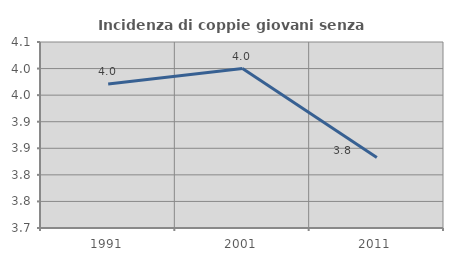
| Category | Incidenza di coppie giovani senza figli |
|---|---|
| 1991.0 | 3.971 |
| 2001.0 | 4 |
| 2011.0 | 3.833 |